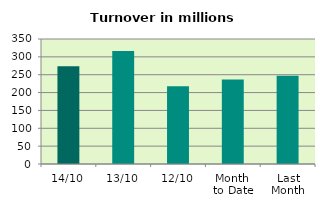
| Category | Series 0 |
|---|---|
| 14/10 | 273.401 |
| 13/10 | 316.442 |
| 12/10 | 217.993 |
| Month 
to Date | 236.69 |
| Last
Month | 247.353 |